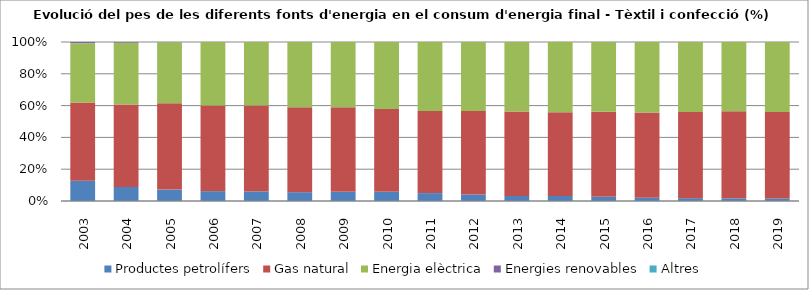
| Category | Productes petrolífers | Gas natural | Energia elèctrica | Energies renovables | Altres |
|---|---|---|---|---|---|
| 2003.0 | 49.84 | 192.35 | 146.12 | 2.85 | 0 |
| 2004.0 | 31.39 | 184.49 | 137.93 | 1.46 | 0 |
| 2005.0 | 22.76 | 171.61 | 121.85 | 0.27 | 0 |
| 2006.0 | 17.1 | 149.2 | 110.6 | 0 | 0 |
| 2007.0 | 15.33 | 138.68 | 102.3 | 0 | 0 |
| 2008.0 | 11.59 | 111.9 | 86.07 | 0 | 0 |
| 2009.0 | 9.6 | 88.71 | 68.39 | 0 | 0 |
| 2010.0 | 9.63 | 87.36 | 70.66 | 0 | 0 |
| 2011.0 | 7.95 | 82.4 | 69.46 | 0 | 0 |
| 2012.0 | 6.15 | 79.15 | 65.5 | 0 | 0 |
| 2013.0 | 4.74 | 79.16 | 65.14 | 0 | 0 |
| 2014.0 | 4.56 | 76.36 | 64.01 | 0 | 0 |
| 2015.0 | 3.76 | 77.33 | 63.53 | 0 | 0 |
| 2016.0 | 2.89 | 76.77 | 63.56 | 0 | 0 |
| 2017.0 | 2.55 | 78.51 | 63.88 | 0 | 0 |
| 2018.0 | 2.39 | 77.53 | 61.85 | 0 | 0 |
| 2019.0 | 2.13 | 72.81 | 58.92 | 0 | 0 |